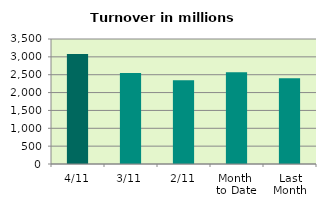
| Category | Series 0 |
|---|---|
| 4/11 | 3081.496 |
| 3/11 | 2544.675 |
| 2/11 | 2344.522 |
| Month 
to Date | 2569 |
| Last
Month | 2399.244 |